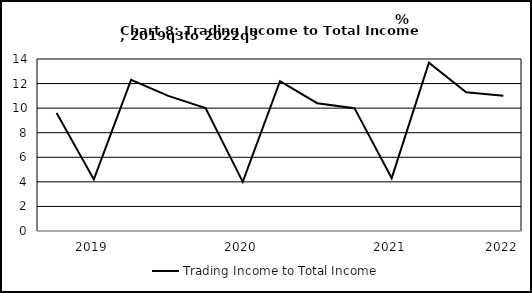
| Category | Trading Income to Total Income |
|---|---|
| nan | 9.6 |
| 2019.0 | 4.2 |
| nan | 12.3 |
| nan | 11 |
| nan | 10 |
| 2020.0 | 4 |
| nan | 12.2 |
| nan | 10.4 |
| nan | 10 |
| 2021.0 | 4.3 |
| nan | 13.7 |
| nan | 11.3 |
| 2022.0 | 11 |